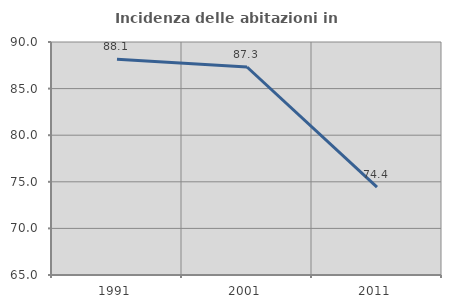
| Category | Incidenza delle abitazioni in proprietà  |
|---|---|
| 1991.0 | 88.148 |
| 2001.0 | 87.319 |
| 2011.0 | 74.419 |